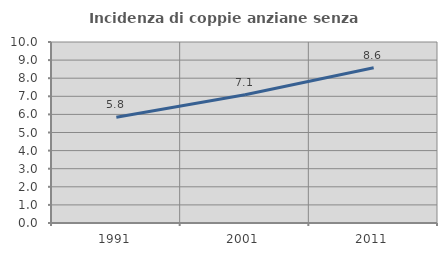
| Category | Incidenza di coppie anziane senza figli  |
|---|---|
| 1991.0 | 5.843 |
| 2001.0 | 7.081 |
| 2011.0 | 8.58 |